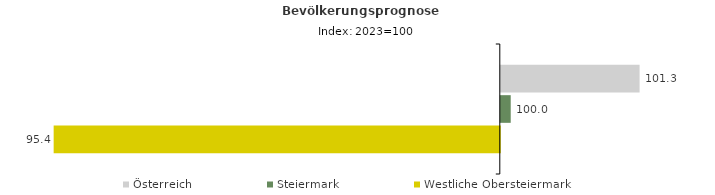
| Category | Österreich | Steiermark | Westliche Obersteiermark |
|---|---|---|---|
| 2023.0 | 101.3 | 100 | 95.4 |